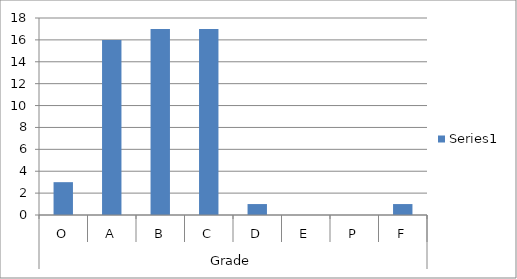
| Category | Series 0 |
|---|---|
| 0 | 3 |
| 1 | 16 |
| 2 | 17 |
| 3 | 17 |
| 4 | 1 |
| 5 | 0 |
| 6 | 0 |
| 7 | 1 |